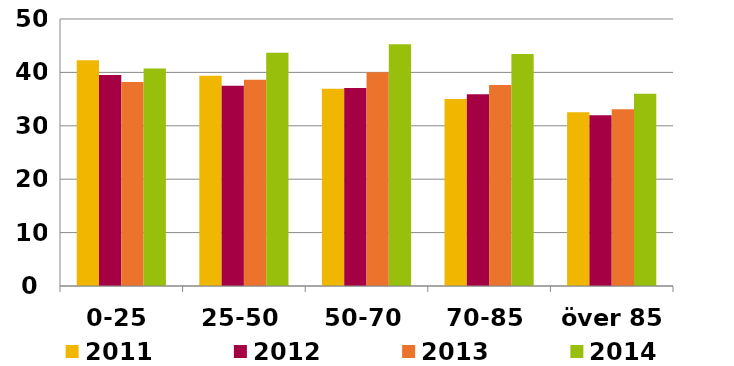
| Category | 2011 | 2012 | 2013 | 2014 |
|---|---|---|---|---|
| 0-25 | 42.287 | 39.51 | 38.181 | 40.726 |
| 25-50 | 39.378 | 37.48 | 38.607 | 43.668 |
| 50-70 | 36.95 | 37.088 | 40.012 | 45.249 |
| 70-85 | 34.997 | 35.886 | 37.663 | 43.43 |
| över 85 | 32.547 | 31.988 | 33.111 | 35.979 |